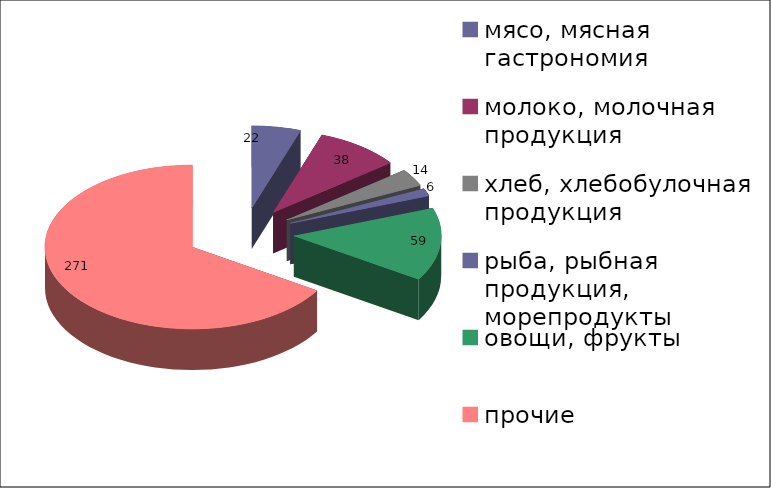
| Category | Series 0 |
|---|---|
| мясо, мясная гастрономия | 22 |
| молоко, молочная продукция | 38 |
| хлеб, хлебобулочная продукция | 14 |
| рыба, рыбная продукция, морепродукты | 6 |
| овощи, фрукты | 59 |
| прочие | 271 |